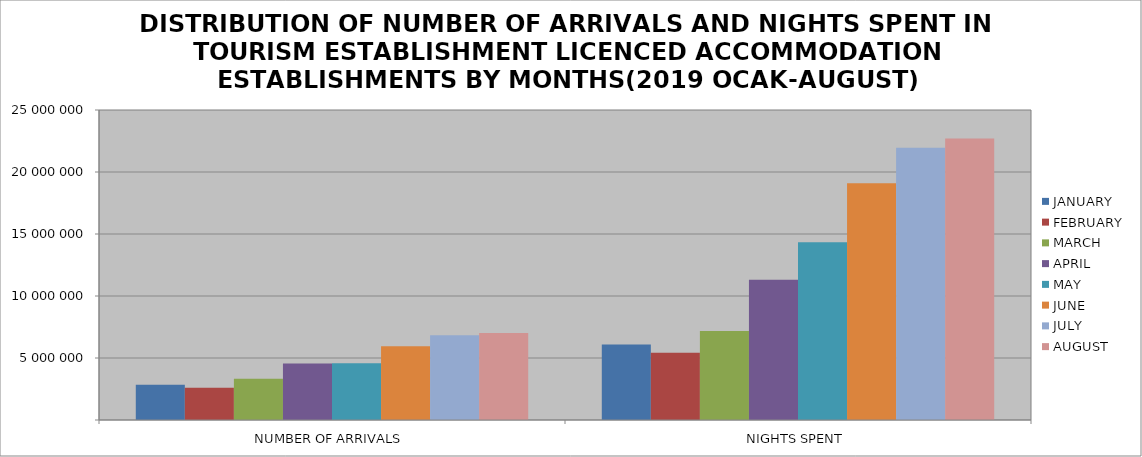
| Category | JANUARY | FEBRUARY | MARCH | APRIL | MAY | JUNE | JULY | AUGUST |
|---|---|---|---|---|---|---|---|---|
| NUMBER OF ARRIVALS | 2833509 | 2607189 | 3326719 | 4561709 | 4585981 | 5949977 | 6830740 | 7020795 |
| NIGHTS SPENT | 6098050 | 5425989 | 7182593 | 11302946 | 14338328 | 19092571 | 21955256 | 22706728 |